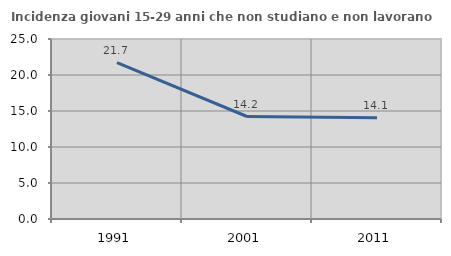
| Category | Incidenza giovani 15-29 anni che non studiano e non lavorano  |
|---|---|
| 1991.0 | 21.711 |
| 2001.0 | 14.236 |
| 2011.0 | 14.062 |